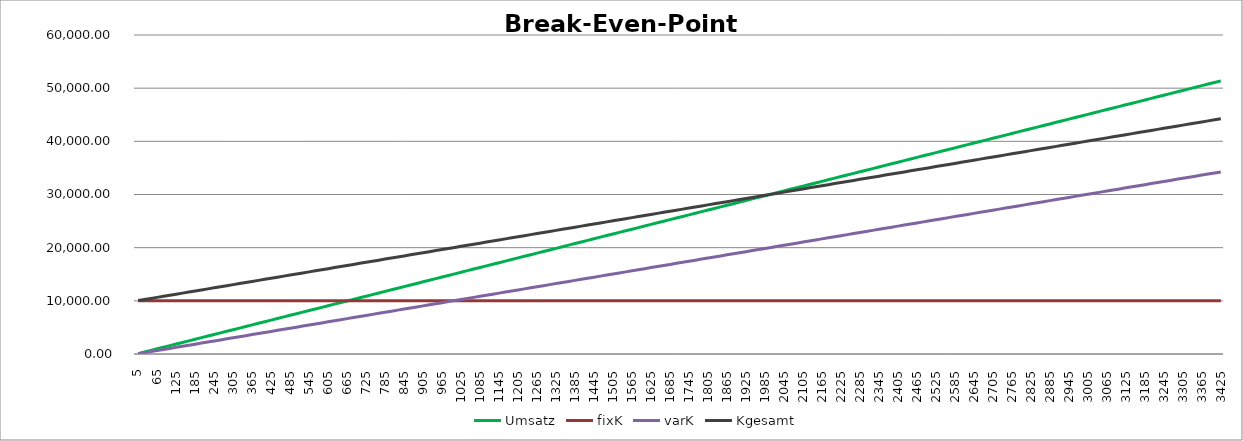
| Category | Umsatz | fixK | varK | Kgesamt |
|---|---|---|---|---|
| 5.0 | 75 | 10000 | 50 | 10050 |
| 25.0 | 375 | 10000 | 250 | 10250 |
| 45.0 | 675 | 10000 | 450 | 10450 |
| 65.0 | 975 | 10000 | 650 | 10650 |
| 85.0 | 1275 | 10000 | 850 | 10850 |
| 105.0 | 1575 | 10000 | 1050 | 11050 |
| 125.0 | 1875 | 10000 | 1250 | 11250 |
| 145.0 | 2175 | 10000 | 1450 | 11450 |
| 165.0 | 2475 | 10000 | 1650 | 11650 |
| 185.0 | 2775 | 10000 | 1850 | 11850 |
| 205.0 | 3075 | 10000 | 2050 | 12050 |
| 225.0 | 3375 | 10000 | 2250 | 12250 |
| 245.0 | 3675 | 10000 | 2450 | 12450 |
| 265.0 | 3975 | 10000 | 2650 | 12650 |
| 285.0 | 4275 | 10000 | 2850 | 12850 |
| 305.0 | 4575 | 10000 | 3050 | 13050 |
| 325.0 | 4875 | 10000 | 3250 | 13250 |
| 345.0 | 5175 | 10000 | 3450 | 13450 |
| 365.0 | 5475 | 10000 | 3650 | 13650 |
| 385.0 | 5775 | 10000 | 3850 | 13850 |
| 405.0 | 6075 | 10000 | 4050 | 14050 |
| 425.0 | 6375 | 10000 | 4250 | 14250 |
| 445.0 | 6675 | 10000 | 4450 | 14450 |
| 465.0 | 6975 | 10000 | 4650 | 14650 |
| 485.0 | 7275 | 10000 | 4850 | 14850 |
| 505.0 | 7575 | 10000 | 5050 | 15050 |
| 525.0 | 7875 | 10000 | 5250 | 15250 |
| 545.0 | 8175 | 10000 | 5450 | 15450 |
| 565.0 | 8475 | 10000 | 5650 | 15650 |
| 585.0 | 8775 | 10000 | 5850 | 15850 |
| 605.0 | 9075 | 10000 | 6050 | 16050 |
| 625.0 | 9375 | 10000 | 6250 | 16250 |
| 645.0 | 9675 | 10000 | 6450 | 16450 |
| 665.0 | 9975 | 10000 | 6650 | 16650 |
| 685.0 | 10275 | 10000 | 6850 | 16850 |
| 705.0 | 10575 | 10000 | 7050 | 17050 |
| 725.0 | 10875 | 10000 | 7250 | 17250 |
| 745.0 | 11175 | 10000 | 7450 | 17450 |
| 765.0 | 11475 | 10000 | 7650 | 17650 |
| 785.0 | 11775 | 10000 | 7850 | 17850 |
| 805.0 | 12075 | 10000 | 8050 | 18050 |
| 825.0 | 12375 | 10000 | 8250 | 18250 |
| 845.0 | 12675 | 10000 | 8450 | 18450 |
| 865.0 | 12975 | 10000 | 8650 | 18650 |
| 885.0 | 13275 | 10000 | 8850 | 18850 |
| 905.0 | 13575 | 10000 | 9050 | 19050 |
| 925.0 | 13875 | 10000 | 9250 | 19250 |
| 945.0 | 14175 | 10000 | 9450 | 19450 |
| 965.0 | 14475 | 10000 | 9650 | 19650 |
| 985.0 | 14775 | 10000 | 9850 | 19850 |
| 1005.0 | 15075 | 10000 | 10050 | 20050 |
| 1025.0 | 15375 | 10000 | 10250 | 20250 |
| 1045.0 | 15675 | 10000 | 10450 | 20450 |
| 1065.0 | 15975 | 10000 | 10650 | 20650 |
| 1085.0 | 16275 | 10000 | 10850 | 20850 |
| 1105.0 | 16575 | 10000 | 11050 | 21050 |
| 1125.0 | 16875 | 10000 | 11250 | 21250 |
| 1145.0 | 17175 | 10000 | 11450 | 21450 |
| 1165.0 | 17475 | 10000 | 11650 | 21650 |
| 1185.0 | 17775 | 10000 | 11850 | 21850 |
| 1205.0 | 18075 | 10000 | 12050 | 22050 |
| 1225.0 | 18375 | 10000 | 12250 | 22250 |
| 1245.0 | 18675 | 10000 | 12450 | 22450 |
| 1265.0 | 18975 | 10000 | 12650 | 22650 |
| 1285.0 | 19275 | 10000 | 12850 | 22850 |
| 1305.0 | 19575 | 10000 | 13050 | 23050 |
| 1325.0 | 19875 | 10000 | 13250 | 23250 |
| 1345.0 | 20175 | 10000 | 13450 | 23450 |
| 1365.0 | 20475 | 10000 | 13650 | 23650 |
| 1385.0 | 20775 | 10000 | 13850 | 23850 |
| 1405.0 | 21075 | 10000 | 14050 | 24050 |
| 1425.0 | 21375 | 10000 | 14250 | 24250 |
| 1445.0 | 21675 | 10000 | 14450 | 24450 |
| 1465.0 | 21975 | 10000 | 14650 | 24650 |
| 1485.0 | 22275 | 10000 | 14850 | 24850 |
| 1505.0 | 22575 | 10000 | 15050 | 25050 |
| 1525.0 | 22875 | 10000 | 15250 | 25250 |
| 1545.0 | 23175 | 10000 | 15450 | 25450 |
| 1565.0 | 23475 | 10000 | 15650 | 25650 |
| 1585.0 | 23775 | 10000 | 15850 | 25850 |
| 1605.0 | 24075 | 10000 | 16050 | 26050 |
| 1625.0 | 24375 | 10000 | 16250 | 26250 |
| 1645.0 | 24675 | 10000 | 16450 | 26450 |
| 1665.0 | 24975 | 10000 | 16650 | 26650 |
| 1685.0 | 25275 | 10000 | 16850 | 26850 |
| 1705.0 | 25575 | 10000 | 17050 | 27050 |
| 1725.0 | 25875 | 10000 | 17250 | 27250 |
| 1745.0 | 26175 | 10000 | 17450 | 27450 |
| 1765.0 | 26475 | 10000 | 17650 | 27650 |
| 1785.0 | 26775 | 10000 | 17850 | 27850 |
| 1805.0 | 27075 | 10000 | 18050 | 28050 |
| 1825.0 | 27375 | 10000 | 18250 | 28250 |
| 1845.0 | 27675 | 10000 | 18450 | 28450 |
| 1865.0 | 27975 | 10000 | 18650 | 28650 |
| 1885.0 | 28275 | 10000 | 18850 | 28850 |
| 1905.0 | 28575 | 10000 | 19050 | 29050 |
| 1925.0 | 28875 | 10000 | 19250 | 29250 |
| 1945.0 | 29175 | 10000 | 19450 | 29450 |
| 1965.0 | 29475 | 10000 | 19650 | 29650 |
| 1985.0 | 29775 | 10000 | 19850 | 29850 |
| 2005.0 | 30075 | 10000 | 20050 | 30050 |
| 2025.0 | 30375 | 10000 | 20250 | 30250 |
| 2045.0 | 30675 | 10000 | 20450 | 30450 |
| 2065.0 | 30975 | 10000 | 20650 | 30650 |
| 2085.0 | 31275 | 10000 | 20850 | 30850 |
| 2105.0 | 31575 | 10000 | 21050 | 31050 |
| 2125.0 | 31875 | 10000 | 21250 | 31250 |
| 2145.0 | 32175 | 10000 | 21450 | 31450 |
| 2165.0 | 32475 | 10000 | 21650 | 31650 |
| 2185.0 | 32775 | 10000 | 21850 | 31850 |
| 2205.0 | 33075 | 10000 | 22050 | 32050 |
| 2225.0 | 33375 | 10000 | 22250 | 32250 |
| 2245.0 | 33675 | 10000 | 22450 | 32450 |
| 2265.0 | 33975 | 10000 | 22650 | 32650 |
| 2285.0 | 34275 | 10000 | 22850 | 32850 |
| 2305.0 | 34575 | 10000 | 23050 | 33050 |
| 2325.0 | 34875 | 10000 | 23250 | 33250 |
| 2345.0 | 35175 | 10000 | 23450 | 33450 |
| 2365.0 | 35475 | 10000 | 23650 | 33650 |
| 2385.0 | 35775 | 10000 | 23850 | 33850 |
| 2405.0 | 36075 | 10000 | 24050 | 34050 |
| 2425.0 | 36375 | 10000 | 24250 | 34250 |
| 2445.0 | 36675 | 10000 | 24450 | 34450 |
| 2465.0 | 36975 | 10000 | 24650 | 34650 |
| 2485.0 | 37275 | 10000 | 24850 | 34850 |
| 2505.0 | 37575 | 10000 | 25050 | 35050 |
| 2525.0 | 37875 | 10000 | 25250 | 35250 |
| 2545.0 | 38175 | 10000 | 25450 | 35450 |
| 2565.0 | 38475 | 10000 | 25650 | 35650 |
| 2585.0 | 38775 | 10000 | 25850 | 35850 |
| 2605.0 | 39075 | 10000 | 26050 | 36050 |
| 2625.0 | 39375 | 10000 | 26250 | 36250 |
| 2645.0 | 39675 | 10000 | 26450 | 36450 |
| 2665.0 | 39975 | 10000 | 26650 | 36650 |
| 2685.0 | 40275 | 10000 | 26850 | 36850 |
| 2705.0 | 40575 | 10000 | 27050 | 37050 |
| 2725.0 | 40875 | 10000 | 27250 | 37250 |
| 2745.0 | 41175 | 10000 | 27450 | 37450 |
| 2765.0 | 41475 | 10000 | 27650 | 37650 |
| 2785.0 | 41775 | 10000 | 27850 | 37850 |
| 2805.0 | 42075 | 10000 | 28050 | 38050 |
| 2825.0 | 42375 | 10000 | 28250 | 38250 |
| 2845.0 | 42675 | 10000 | 28450 | 38450 |
| 2865.0 | 42975 | 10000 | 28650 | 38650 |
| 2885.0 | 43275 | 10000 | 28850 | 38850 |
| 2905.0 | 43575 | 10000 | 29050 | 39050 |
| 2925.0 | 43875 | 10000 | 29250 | 39250 |
| 2945.0 | 44175 | 10000 | 29450 | 39450 |
| 2965.0 | 44475 | 10000 | 29650 | 39650 |
| 2985.0 | 44775 | 10000 | 29850 | 39850 |
| 3005.0 | 45075 | 10000 | 30050 | 40050 |
| 3025.0 | 45375 | 10000 | 30250 | 40250 |
| 3045.0 | 45675 | 10000 | 30450 | 40450 |
| 3065.0 | 45975 | 10000 | 30650 | 40650 |
| 3085.0 | 46275 | 10000 | 30850 | 40850 |
| 3105.0 | 46575 | 10000 | 31050 | 41050 |
| 3125.0 | 46875 | 10000 | 31250 | 41250 |
| 3145.0 | 47175 | 10000 | 31450 | 41450 |
| 3165.0 | 47475 | 10000 | 31650 | 41650 |
| 3185.0 | 47775 | 10000 | 31850 | 41850 |
| 3205.0 | 48075 | 10000 | 32050 | 42050 |
| 3225.0 | 48375 | 10000 | 32250 | 42250 |
| 3245.0 | 48675 | 10000 | 32450 | 42450 |
| 3265.0 | 48975 | 10000 | 32650 | 42650 |
| 3285.0 | 49275 | 10000 | 32850 | 42850 |
| 3305.0 | 49575 | 10000 | 33050 | 43050 |
| 3325.0 | 49875 | 10000 | 33250 | 43250 |
| 3345.0 | 50175 | 10000 | 33450 | 43450 |
| 3365.0 | 50475 | 10000 | 33650 | 43650 |
| 3385.0 | 50775 | 10000 | 33850 | 43850 |
| 3405.0 | 51075 | 10000 | 34050 | 44050 |
| 3425.0 | 51375 | 10000 | 34250 | 44250 |